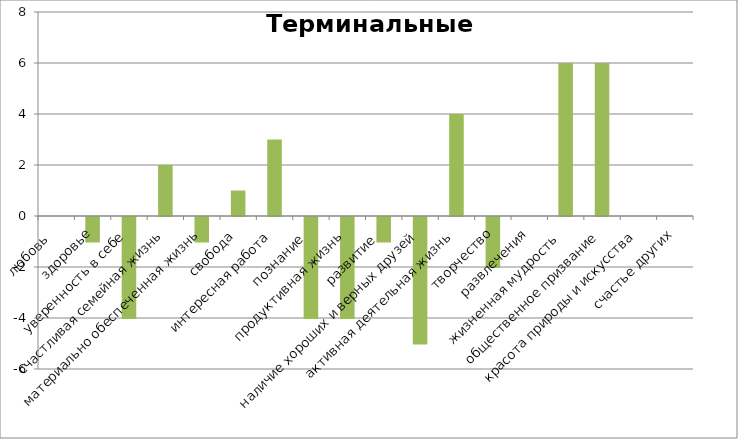
| Category | Терминальные ценности |
|---|---|
| любовь  | 0 |
| здоровье | -1 |
|  уверенность в себе | -4 |
| счастливая семейная жизнь | 2 |
| материально обеспеченная жизнь | -1 |
| свобода | 1 |
| интересная работа | 3 |
| познание  | -4 |
| продуктивная жизнь | -4 |
| развитие  | -1 |
| наличие хороших и верных друзей | -5 |
|  активная деятельная жизнь  | 4 |
| творчество | -2 |
| развлечения | 0 |
| жизненная мудрость  | 6 |
| общественное призвание | 6 |
| красота природы и искусства | 0 |
| счастье других | 0 |